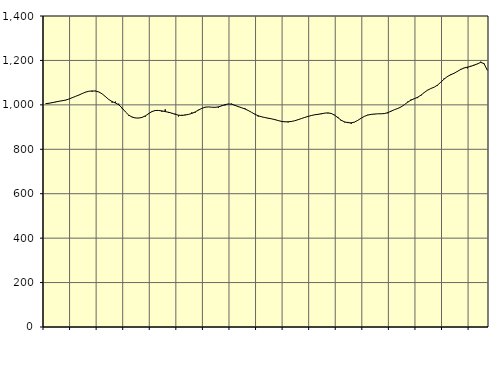
| Category | Piggar | Series 1 |
|---|---|---|
| nan | 1004.8 | 1005.51 |
| 87.0 | 1006.3 | 1007.26 |
| 87.0 | 1012.5 | 1010.03 |
| 87.0 | 1011.9 | 1013.34 |
| nan | 1016.5 | 1016.12 |
| 88.0 | 1019.9 | 1018.58 |
| 88.0 | 1020.4 | 1021.54 |
| 88.0 | 1026.1 | 1026.12 |
| nan | 1033.2 | 1032.2 |
| 89.0 | 1037.8 | 1038.21 |
| 89.0 | 1043.7 | 1044.15 |
| 89.0 | 1050.5 | 1050.85 |
| nan | 1058 | 1057.15 |
| 90.0 | 1061.3 | 1061.14 |
| 90.0 | 1059.1 | 1062.72 |
| 90.0 | 1063.6 | 1062.07 |
| nan | 1058.9 | 1058.08 |
| 91.0 | 1049.6 | 1049.64 |
| 91.0 | 1038.5 | 1037.22 |
| 91.0 | 1024.8 | 1024.09 |
| nan | 1010.1 | 1014.65 |
| 92.0 | 1014.7 | 1008.5 |
| 92.0 | 1005.3 | 1000.41 |
| 92.0 | 983.9 | 986.2 |
| nan | 969.5 | 968.64 |
| 93.0 | 951.6 | 954.05 |
| 93.0 | 946.1 | 944.99 |
| 93.0 | 941.9 | 941 |
| nan | 941.4 | 940.5 |
| 94.0 | 942.5 | 943.37 |
| 94.0 | 946.7 | 950.44 |
| 94.0 | 961.9 | 960.38 |
| nan | 967.7 | 969.74 |
| 95.0 | 976.5 | 974.57 |
| 95.0 | 975.6 | 974.82 |
| 95.0 | 968.8 | 972.82 |
| nan | 979.9 | 969.72 |
| 96.0 | 963.7 | 966.71 |
| 96.0 | 961.3 | 962.6 |
| 96.0 | 960.4 | 957.45 |
| nan | 947.8 | 953.65 |
| 97.0 | 955 | 952.32 |
| 97.0 | 956.2 | 954.07 |
| 97.0 | 955.9 | 957.08 |
| nan | 966.2 | 961.3 |
| 98.0 | 964.8 | 967.96 |
| 98.0 | 977.8 | 976.19 |
| 98.0 | 985.8 | 984.06 |
| nan | 990.5 | 989.47 |
| 99.0 | 990.5 | 990.64 |
| 99.0 | 989.4 | 989.43 |
| 99.0 | 988.8 | 988.86 |
| nan | 987.2 | 990.88 |
| 0.0 | 997.7 | 995.38 |
| 0.0 | 997.4 | 1000.78 |
| 0.0 | 1002.8 | 1004.08 |
| nan | 1005.5 | 1002.96 |
| 1.0 | 996.5 | 997.92 |
| 1.0 | 993.4 | 991.99 |
| 1.0 | 987.9 | 987.09 |
| nan | 984.8 | 981.61 |
| 2.0 | 973.7 | 974.58 |
| 2.0 | 966.1 | 966.24 |
| 2.0 | 959.3 | 957.79 |
| nan | 947.3 | 950.95 |
| 3.0 | 947.2 | 946.34 |
| 3.0 | 943.5 | 943.02 |
| 3.0 | 938.5 | 939.9 |
| nan | 936.5 | 937.07 |
| 4.0 | 931.6 | 933.67 |
| 4.0 | 929.2 | 929.4 |
| 4.0 | 923.6 | 925.66 |
| nan | 925.2 | 923.67 |
| 5.0 | 921.1 | 923.8 |
| 5.0 | 926.3 | 925.28 |
| 5.0 | 928.8 | 928.47 |
| nan | 932.4 | 933.1 |
| 6.0 | 937.7 | 938.26 |
| 6.0 | 944 | 943.36 |
| 6.0 | 948.2 | 947.87 |
| nan | 950.9 | 952.06 |
| 7.0 | 955.9 | 955.2 |
| 7.0 | 955.7 | 957.35 |
| 7.0 | 958.1 | 959.97 |
| nan | 963.4 | 962.69 |
| 8.0 | 961.8 | 963.87 |
| 8.0 | 959.5 | 961.27 |
| 8.0 | 955.2 | 953.58 |
| nan | 945.8 | 942.27 |
| 9.0 | 927.4 | 930.68 |
| 9.0 | 921.3 | 923.42 |
| 9.0 | 923.2 | 919.83 |
| nan | 914.3 | 919.07 |
| 10.0 | 921.8 | 922.42 |
| 10.0 | 929.9 | 930.3 |
| 10.0 | 940.1 | 940.01 |
| nan | 948.7 | 948.38 |
| 11.0 | 955.2 | 954.02 |
| 11.0 | 956.2 | 957.02 |
| 11.0 | 957.4 | 958.66 |
| nan | 959.6 | 959.64 |
| 12.0 | 959.7 | 959.79 |
| 12.0 | 959.4 | 960.88 |
| 12.0 | 962.2 | 964.83 |
| nan | 972.5 | 971.41 |
| 13.0 | 978.3 | 978.11 |
| 13.0 | 984.6 | 983.55 |
| 13.0 | 990.3 | 990.49 |
| nan | 1000.4 | 1000.42 |
| 14.0 | 1014.2 | 1011.82 |
| 14.0 | 1023.8 | 1021.3 |
| 14.0 | 1029.2 | 1027.67 |
| nan | 1030.3 | 1034.1 |
| 15.0 | 1040.9 | 1043.47 |
| 15.0 | 1054.3 | 1055.47 |
| 15.0 | 1067.1 | 1066.08 |
| nan | 1073.4 | 1073.59 |
| 16.0 | 1079.5 | 1079.74 |
| 16.0 | 1086.7 | 1088.95 |
| 16.0 | 1102.8 | 1102.08 |
| nan | 1119.1 | 1116.16 |
| 17.0 | 1125.3 | 1127.73 |
| 17.0 | 1138.3 | 1135.57 |
| 17.0 | 1141.5 | 1142.33 |
| nan | 1149.6 | 1150.87 |
| 18.0 | 1161.8 | 1159.43 |
| 18.0 | 1166.9 | 1165.85 |
| 18.0 | 1164.4 | 1169.81 |
| nan | 1175.7 | 1173.31 |
| 19.0 | 1180.2 | 1178.49 |
| 19.0 | 1183.3 | 1184.49 |
| 19.0 | 1194.3 | 1191.1 |
| nan | 1183.7 | 1185.82 |
| 20.0 | 1155.9 | 1155.46 |